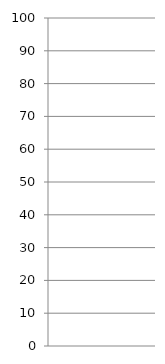
| Category | Series 0 |
|---|---|
| 0 | -33.333 |